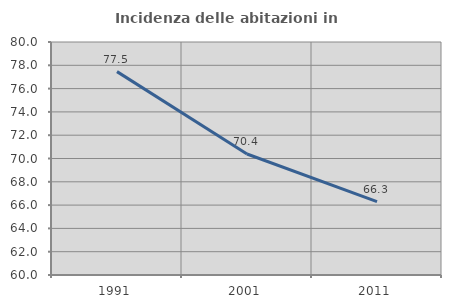
| Category | Incidenza delle abitazioni in proprietà  |
|---|---|
| 1991.0 | 77.457 |
| 2001.0 | 70.385 |
| 2011.0 | 66.3 |